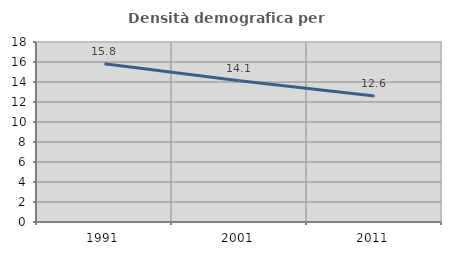
| Category | Densità demografica |
|---|---|
| 1991.0 | 15.822 |
| 2001.0 | 14.135 |
| 2011.0 | 12.595 |